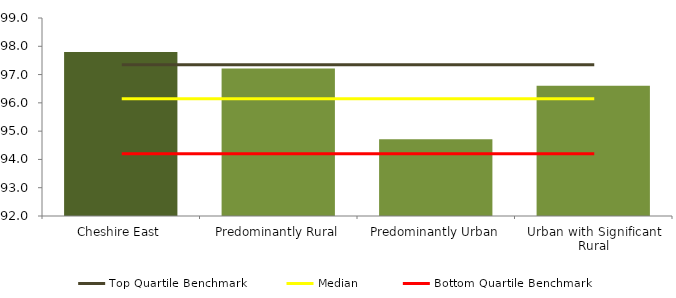
| Category | Series 0 |
|---|---|
| Cheshire East | 97.8 |
| Predominantly Rural | 97.214 |
| Predominantly Urban | 94.711 |
| Urban with Significant Rural | 96.605 |